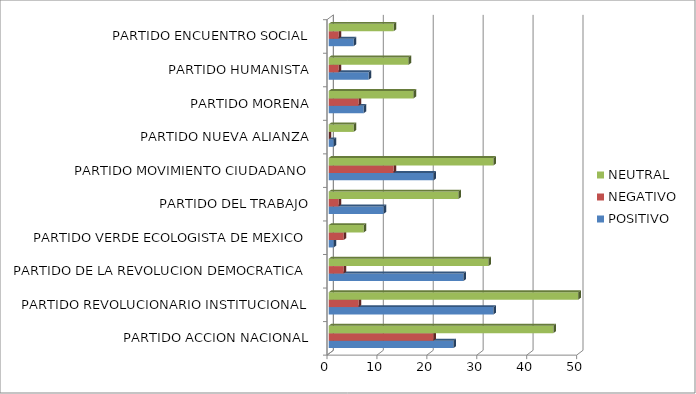
| Category | POSITIVO | NEGATIVO | NEUTRAL |
|---|---|---|---|
| PARTIDO ACCION NACIONAL | 25 | 21 | 45 |
| PARTIDO REVOLUCIONARIO INSTITUCIONAL | 33 | 6 | 50 |
| PARTIDO DE LA REVOLUCION DEMOCRATICA | 27 | 3 | 32 |
| PARTIDO VERDE ECOLOGISTA DE MEXICO | 1 | 3 | 7 |
| PARTIDO DEL TRABAJO | 11 | 2 | 26 |
| PARTIDO MOVIMIENTO CIUDADANO | 21 | 13 | 33 |
| PARTIDO NUEVA ALIANZA | 1 | 0 | 5 |
| PARTIDO MORENA | 7 | 6 | 17 |
| PARTIDO HUMANISTA | 8 | 2 | 16 |
| PARTIDO ENCUENTRO SOCIAL | 5 | 2 | 13 |